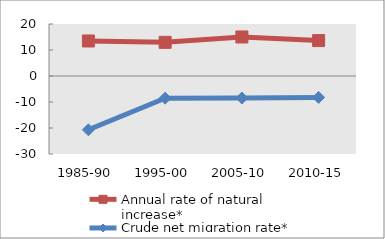
| Category | Annual rate of natural increase* | Crude net migration rate* |
|---|---|---|
| 1985-90 | 13.469 | -20.695 |
| 1995-00 | 12.949 | -8.512 |
| 2005-10 | 15.011 | -8.472 |
| 2010-15 | 13.618 | -8.225 |